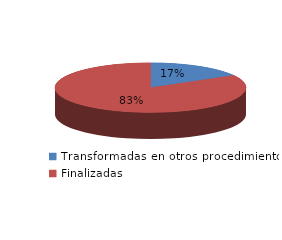
| Category | Series 0 |
|---|---|
| Transformadas en otros procedimientos | 2686 |
| Finalizadas | 13487 |